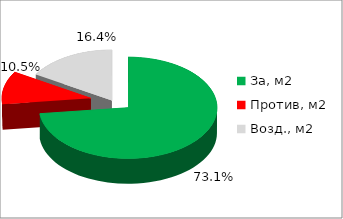
| Category | Series 0 |
|---|---|
| За, м2 | 0.731 |
| Против, м2 | 0.105 |
| Возд., м2 | 0.164 |